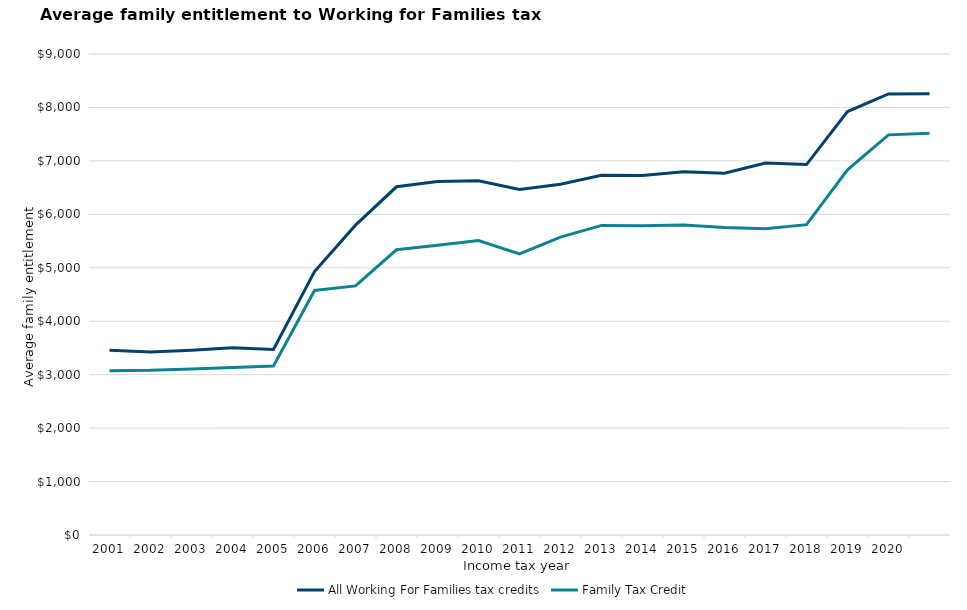
| Category | All Working For Families tax credits | Family Tax Credit |
|---|---|---|
| 2001-03-01 | 3455.8 | 3074.6 |
| 2002-03-01 | 3424.4 | 3080.7 |
| 2003-03-01 | 3456.8 | 3107.4 |
| 2004-03-01 | 3505.6 | 3135.4 |
| 2005-03-01 | 3473.2 | 3161.8 |
| 2006-03-01 | 4928.3 | 4574.9 |
| 2007-03-01 | 5797.8 | 4661 |
| 2008-03-01 | 6515.3 | 5337.2 |
| 2009-03-01 | 6614.7 | 5422.4 |
| 2010-03-01 | 6628.3 | 5511 |
| 2011-03-01 | 6463.7 | 5257.7 |
| 2012-03-01 | 6562.6 | 5574.3 |
| 2013-03-01 | 6731.398 | 5792.787 |
| 2014-03-01 | 6725.824 | 5785.449 |
| 2015-03-01 | 6798.456 | 5798.519 |
| 2016-03-01 | 6770.298 | 5754.246 |
| 2017-03-01 | 6958.908 | 5731.716 |
| 2018-03-01 | 6931.013 | 5806.958 |
| 2019-03-01 | 7922.6 | 6832.8 |
| 2020-03-01 | 8252.7 | 7487 |
| 2021-03-01 | 8256.9 | 7515.5 |